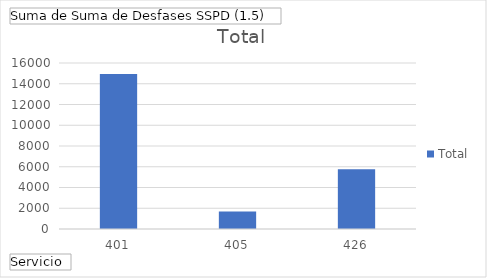
| Category | Total |
|---|---|
| 401 | 14948.946 |
| 405 | 1677.759 |
| 426 | 5750.852 |